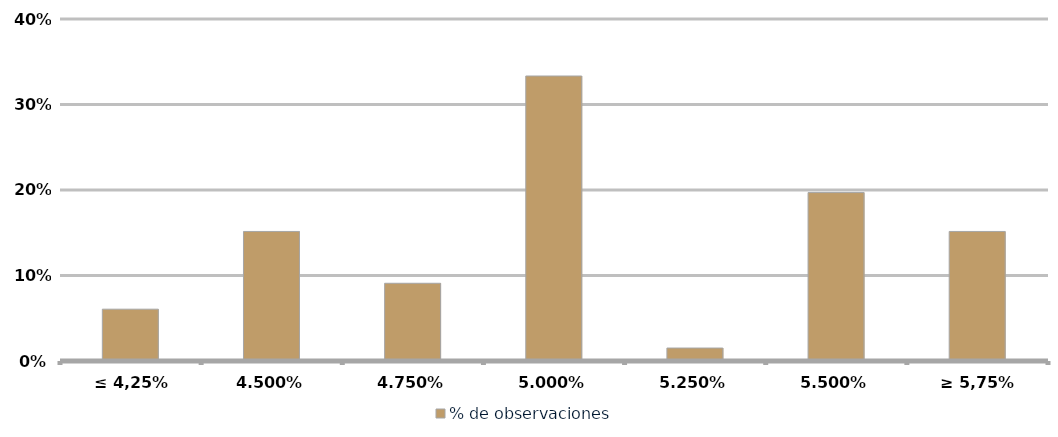
| Category | % de observaciones  |
|---|---|
| ≤ 4,25% | 0.061 |
| 4,50% | 0.152 |
| 4,75% | 0.091 |
| 5,00% | 0.333 |
| 5,25% | 0.015 |
| 5,50% | 0.197 |
| ≥ 5,75% | 0.152 |